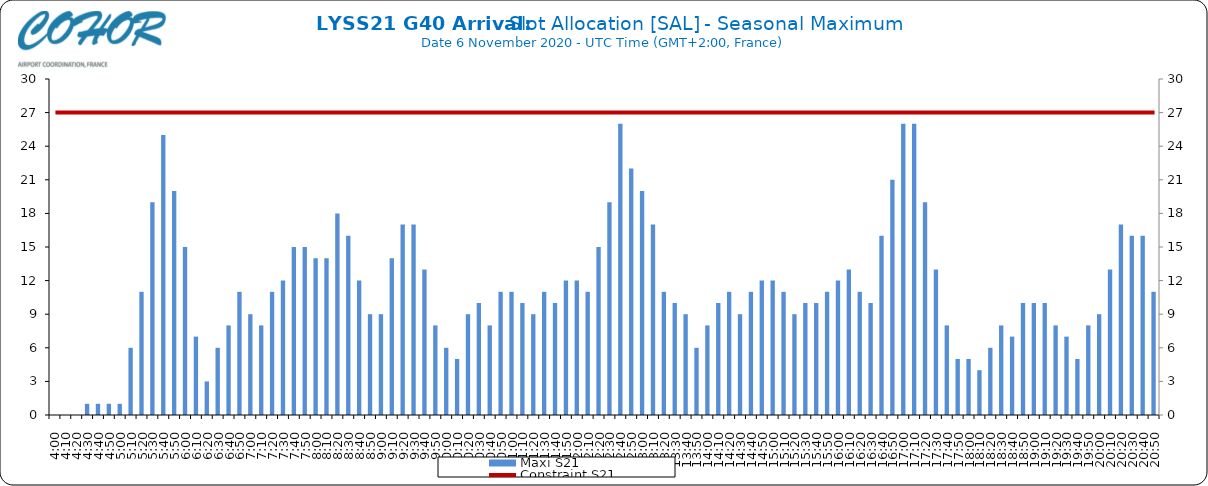
| Category | Maxi S21 |
|---|---|
| 0.16666666666666666 | 0 |
| 0.17361111111111113 | 0 |
| 0.18055555555555555 | 0 |
| 0.1875 | 1 |
| 0.19444444444444445 | 1 |
| 0.20138888888888887 | 1 |
| 0.20833333333333334 | 1 |
| 0.2152777777777778 | 6 |
| 0.2222222222222222 | 11 |
| 0.22916666666666666 | 19 |
| 0.23611111111111113 | 25 |
| 0.24305555555555555 | 20 |
| 0.25 | 15 |
| 0.2569444444444445 | 7 |
| 0.2638888888888889 | 3 |
| 0.2708333333333333 | 6 |
| 0.2777777777777778 | 8 |
| 0.2847222222222222 | 11 |
| 0.2916666666666667 | 9 |
| 0.2986111111111111 | 8 |
| 0.3055555555555555 | 11 |
| 0.3125 | 12 |
| 0.3194444444444445 | 15 |
| 0.3263888888888889 | 15 |
| 0.3333333333333333 | 14 |
| 0.34027777777777773 | 14 |
| 0.34722222222222227 | 18 |
| 0.3541666666666667 | 16 |
| 0.3611111111111111 | 12 |
| 0.3680555555555556 | 9 |
| 0.375 | 9 |
| 0.3819444444444444 | 14 |
| 0.3888888888888889 | 17 |
| 0.3958333333333333 | 17 |
| 0.40277777777777773 | 13 |
| 0.40972222222222227 | 8 |
| 0.4166666666666667 | 6 |
| 0.4236111111111111 | 5 |
| 0.4305555555555556 | 9 |
| 0.4375 | 10 |
| 0.4444444444444444 | 8 |
| 0.4513888888888889 | 11 |
| 0.4583333333333333 | 11 |
| 0.46527777777777773 | 10 |
| 0.47222222222222227 | 9 |
| 0.4791666666666667 | 11 |
| 0.4861111111111111 | 10 |
| 0.4930555555555556 | 12 |
| 0.5 | 12 |
| 0.5069444444444444 | 11 |
| 0.513888888888889 | 15 |
| 0.5208333333333334 | 19 |
| 0.5277777777777778 | 26 |
| 0.5347222222222222 | 22 |
| 0.5416666666666666 | 20 |
| 0.548611111111111 | 17 |
| 0.5555555555555556 | 11 |
| 0.5625 | 10 |
| 0.5694444444444444 | 9 |
| 0.576388888888889 | 6 |
| 0.5833333333333334 | 8 |
| 0.5902777777777778 | 10 |
| 0.5972222222222222 | 11 |
| 0.6041666666666666 | 9 |
| 0.611111111111111 | 11 |
| 0.6180555555555556 | 12 |
| 0.625 | 12 |
| 0.6319444444444444 | 11 |
| 0.638888888888889 | 9 |
| 0.6458333333333334 | 10 |
| 0.6527777777777778 | 10 |
| 0.6597222222222222 | 11 |
| 0.6666666666666666 | 12 |
| 0.6736111111111112 | 13 |
| 0.6805555555555555 | 11 |
| 0.6875 | 10 |
| 0.6944444444444445 | 16 |
| 0.7013888888888888 | 21 |
| 0.7083333333333334 | 26 |
| 0.7152777777777778 | 26 |
| 0.7222222222222222 | 19 |
| 0.7291666666666666 | 13 |
| 0.7361111111111112 | 8 |
| 0.7430555555555555 | 5 |
| 0.75 | 5 |
| 0.7569444444444445 | 4 |
| 0.7638888888888888 | 6 |
| 0.7708333333333334 | 8 |
| 0.7777777777777778 | 7 |
| 0.7847222222222222 | 10 |
| 0.7916666666666666 | 10 |
| 0.7986111111111112 | 10 |
| 0.8055555555555555 | 8 |
| 0.8125 | 7 |
| 0.8194444444444445 | 5 |
| 0.8263888888888888 | 8 |
| 0.8333333333333334 | 9 |
| 0.8402777777777778 | 13 |
| 0.8472222222222222 | 17 |
| 0.8541666666666666 | 16 |
| 0.8611111111111112 | 16 |
| 0.8680555555555555 | 11 |